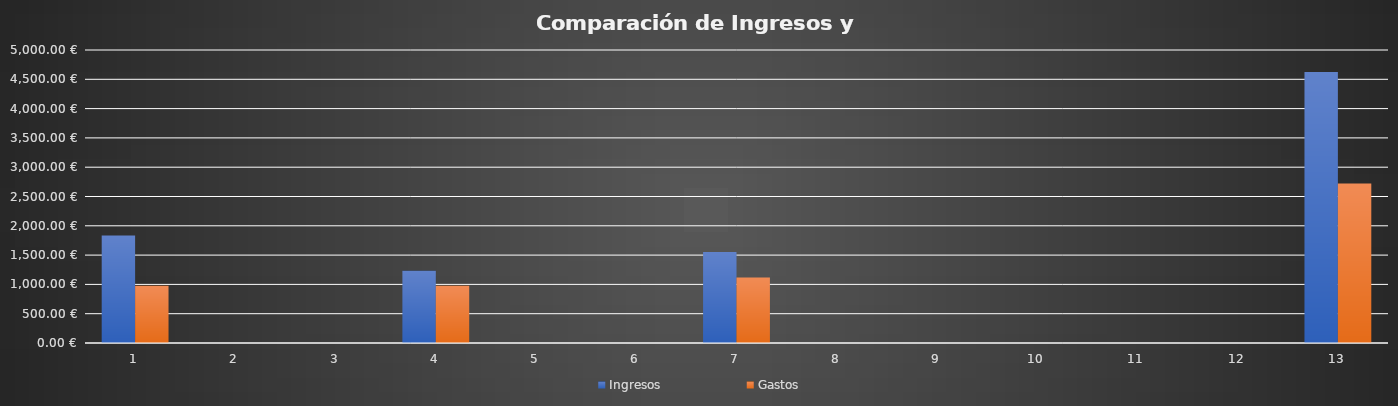
| Category | Ingresos | Gastos |
|---|---|---|
| 0 | 1835 | 975 |
| 1 | 0 | 0 |
| 2 | 0 | 0 |
| 3 | 1233 | 976 |
| 4 | 0 | 0 |
| 5 | 0 | 0 |
| 6 | 1555 | 1118 |
| 7 | 0 | 0 |
| 8 | 0 | 0 |
| 9 | 0 | 0 |
| 10 | 0 | 0 |
| 11 | 0 | 0 |
| 12 | 4623 | 2723 |